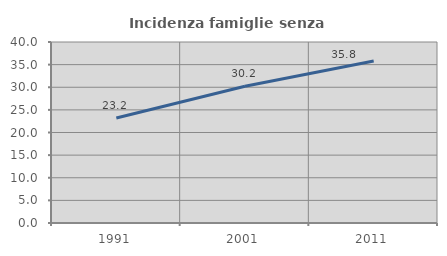
| Category | Incidenza famiglie senza nuclei |
|---|---|
| 1991.0 | 23.196 |
| 2001.0 | 30.233 |
| 2011.0 | 35.796 |